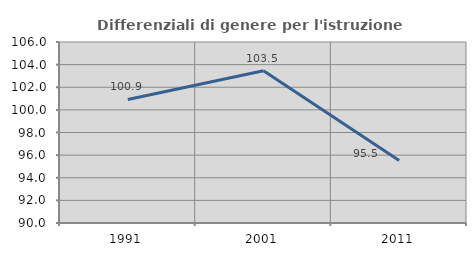
| Category | Differenziali di genere per l'istruzione superiore |
|---|---|
| 1991.0 | 100.919 |
| 2001.0 | 103.456 |
| 2011.0 | 95.523 |